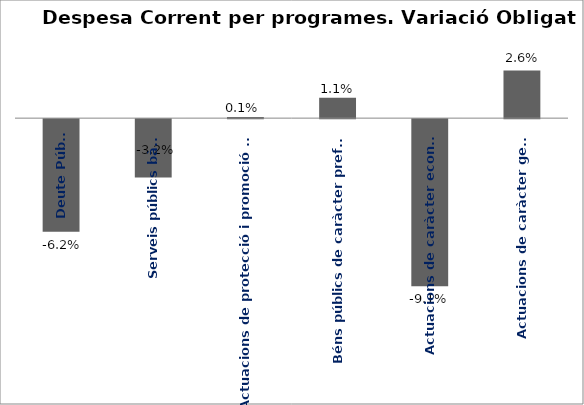
| Category | Series 0 |
|---|---|
| Deute Públic | -0.062 |
| Serveis públics bàsics | -0.032 |
| Actuacions de protecció i promoció social | 0.001 |
| Béns públics de caràcter preferent | 0.011 |
| Actuacions de caràcter econòmic | -0.091 |
| Actuacions de caràcter general | 0.026 |